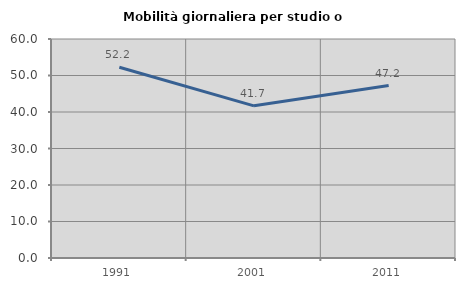
| Category | Mobilità giornaliera per studio o lavoro |
|---|---|
| 1991.0 | 52.249 |
| 2001.0 | 41.689 |
| 2011.0 | 47.245 |